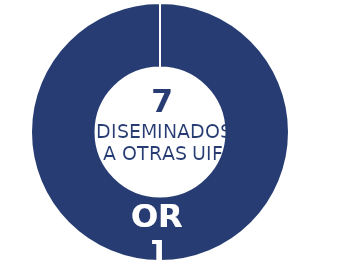
| Category | Series 0 |
|---|---|
| Física | 13 |
| Jurídica | 0 |